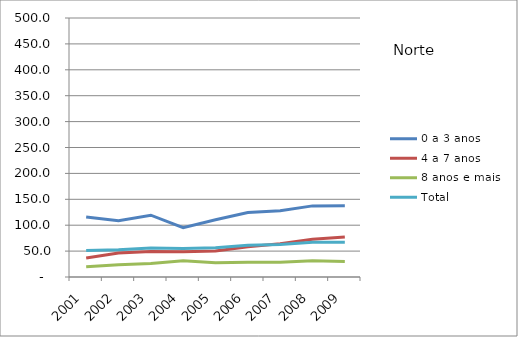
| Category | 0 a 3 anos | 4 a 7 anos | 8 anos e mais | Total |
|---|---|---|---|---|
| 2001.0 | 116 | 36.5 | 19.6 | 51.2 |
| 2002.0 | 108.6 | 46.3 | 23.8 | 52.5 |
| 2003.0 | 119.3 | 49.2 | 25.9 | 55.9 |
| 2004.0 | 95.3 | 48.7 | 31.4 | 55 |
| 2005.0 | 110.6 | 50.3 | 27.7 | 56.6 |
| 2006.0 | 124.6 | 58.4 | 28.6 | 61.4 |
| 2007.0 | 128.1 | 64.4 | 28.5 | 62.8 |
| 2008.0 | 137.3 | 72.8 | 31.3 | 67.2 |
| 2009.0 | 137.5 | 77.3 | 30 | 67 |